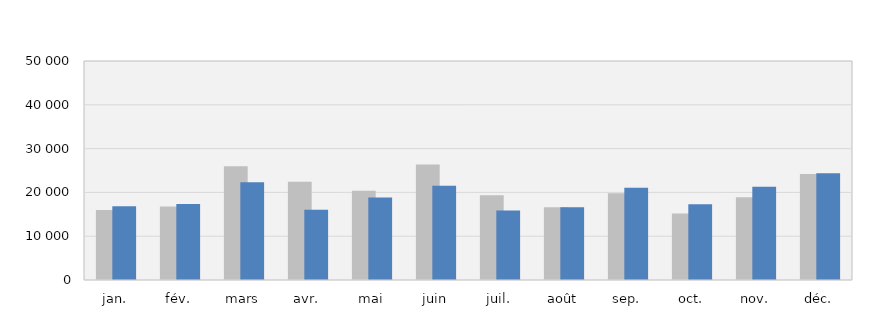
| Category | 2021 | 2022 |
|---|---|---|
| jan. | 15993 | 16812 |
| fév. | 16783 | 17363 |
| mars | 25945 | 22291 |
| avr. | 22440 | 16041 |
| mai | 20362 | 18846 |
| juin | 26386 | 21522 |
| juil. | 19365 | 15879 |
| août | 16622 | 16607 |
| sep. | 19825 | 21089 |
| oct. | 15168 | 17281 |
| nov. | 18918 | 21273 |
| déc. | 24215 | 24399 |